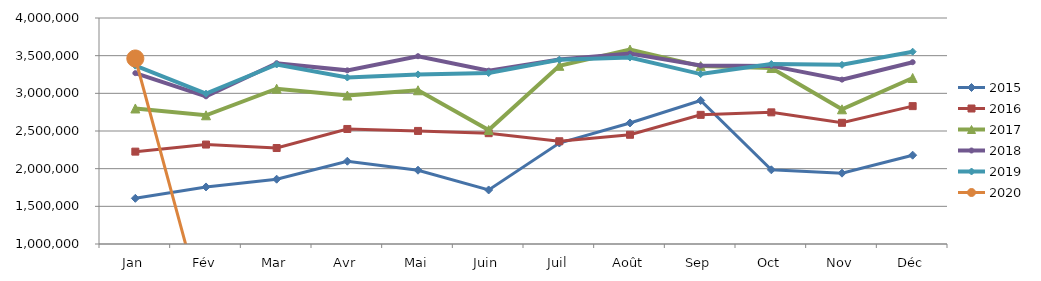
| Category | 2015 | 2016 | 2017 | 2018 | 2019 | 2020 |
|---|---|---|---|---|---|---|
| Jan | 1606333.482 | 2226093.309 | 2798915.391 | 3268127.156 | 3367510.542 | 3462441.736 |
| Fév | 1757411.057 | 2320135.002 | 2708507.11 | 2960518.709 | 2995707.194 | 0 |
| Mar | 1860162.235 | 2274111.99 | 3061215.361 | 3399788.443 | 3382590.899 | 0 |
| Avr | 2098793.379 | 2526794.87 | 2970911.094 | 3304906.324 | 3209954.832 | 0 |
| Mai | 1979551.026 | 2500868.782 | 3040805.262 | 3492911.082 | 3251146.092 | 0 |
| Juin | 1717368.136 | 2471115.702 | 2513480.318 | 3300924.802 | 3269085.474 | 0 |
| Juil | 2340589.709 | 2363852.978 | 3365511.031 | 3448603.566 | 3445052.713 | 0 |
| Août | 2606695.251 | 2449927.953 | 3580436.797 | 3528173.012 | 3474993.525 | 0 |
| Sep | 2905220.31 | 2714390.875 | 3361524.335 | 3369626.193 | 3255644.054 | 0 |
| Oct | 1984901.649 | 2747632.929 | 3335934.501 | 3364260.879 | 3388972.2 | 0 |
| Nov | 1940228.65 | 2608583.302 | 2787992.168 | 3181888.576 | 3378477.919 | 0 |
| Déc | 2178977.981 | 2830164.13 | 3203732.398 | 3413454.996 | 3552894.26 | 0 |